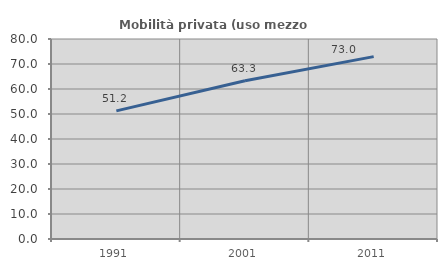
| Category | Mobilità privata (uso mezzo privato) |
|---|---|
| 1991.0 | 51.24 |
| 2001.0 | 63.322 |
| 2011.0 | 72.956 |